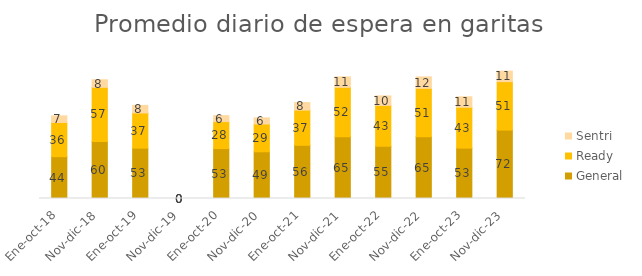
| Category | General | Ready | Sentri |
|---|---|---|---|
| Ene-oct-18 | 44 | 36 | 7 |
| Nov-dic-18 | 60 | 57 | 8 |
| Ene-oct-19 | 53 | 37 | 8 |
| Nov-dic-19 | 0 | 0 | 0 |
| Ene-oct-20 | 52.557 | 28.357 | 6.324 |
| Nov-dic-20 | 49.176 | 29.255 | 6.448 |
| Ene-oct-21 | 56 | 37 | 8 |
| Nov-dic-21 | 65 | 52 | 11 |
| Ene-oct-22 | 55 | 43 | 10 |
| Nov-dic-22 | 65 | 51 | 12 |
| Ene-oct-23 | 53 | 43 | 11 |
| Nov-dic-23 | 72 | 51 | 11 |